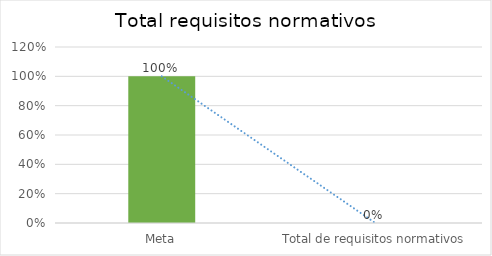
| Category | Series 0 |
|---|---|
| Meta | 1 |
| Total de requisitos normativos | 0 |